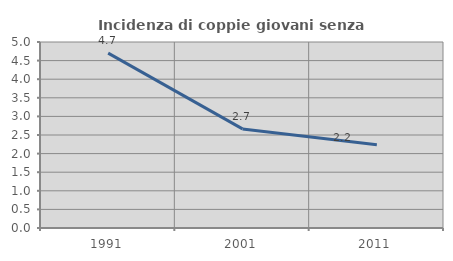
| Category | Incidenza di coppie giovani senza figli |
|---|---|
| 1991.0 | 4.701 |
| 2001.0 | 2.664 |
| 2011.0 | 2.239 |